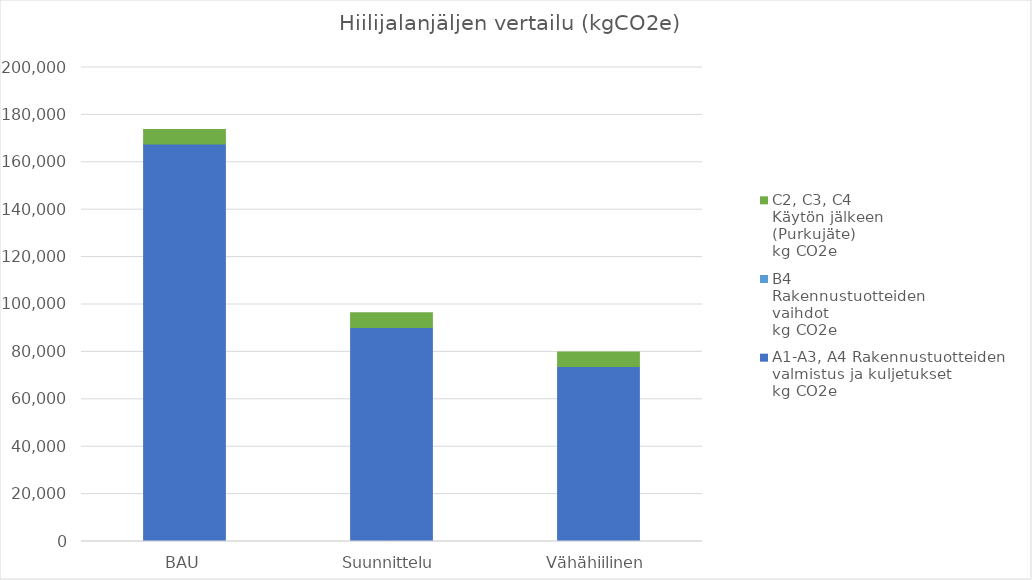
| Category | A1-A3, A4 Rakennustuotteiden 
valmistus ja kuljetukset
kg CO2e  | B4 
Rakennustuotteiden 
vaihdot
kg CO2e  | C2, C3, C4 
Käytön jälkeen 
(Purkujäte)
kg CO2e  |
|---|---|---|---|
| BAU | 167700 | 0 | 6150 |
| Suunnittelu | 90330 | 0 | 6150 |
| Vähähiilinen | 73830 | 0 | 6150 |